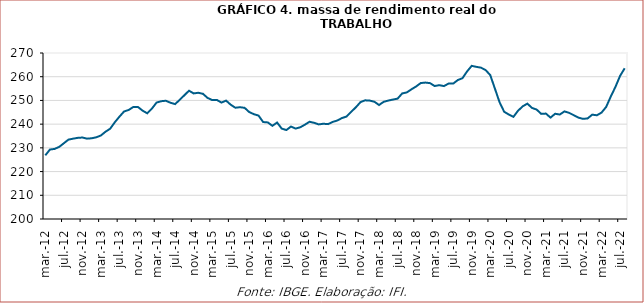
| Category | Massa de rendimento real do trabalho |
|---|---|
| 2012-03-01 | 226.842 |
| 2012-04-01 | 229.283 |
| 2012-05-01 | 229.555 |
| 2012-06-01 | 230.42 |
| 2012-07-01 | 231.95 |
| 2012-08-01 | 233.484 |
| 2012-09-01 | 233.881 |
| 2012-10-01 | 234.221 |
| 2012-11-01 | 234.352 |
| 2012-12-01 | 233.886 |
| 2013-01-01 | 234.04 |
| 2013-02-01 | 234.458 |
| 2013-03-01 | 235.239 |
| 2013-04-01 | 236.821 |
| 2013-05-01 | 238.086 |
| 2013-06-01 | 240.813 |
| 2013-07-01 | 243.174 |
| 2013-08-01 | 245.356 |
| 2013-09-01 | 245.987 |
| 2013-10-01 | 247.263 |
| 2013-11-01 | 247.222 |
| 2013-12-01 | 245.667 |
| 2014-01-01 | 244.569 |
| 2014-02-01 | 246.558 |
| 2014-03-01 | 249.095 |
| 2014-04-01 | 249.669 |
| 2014-05-01 | 249.868 |
| 2014-06-01 | 249.028 |
| 2014-07-01 | 248.457 |
| 2014-08-01 | 250.255 |
| 2014-09-01 | 252.189 |
| 2014-10-01 | 254.101 |
| 2014-11-01 | 252.96 |
| 2014-12-01 | 253.228 |
| 2015-01-01 | 252.799 |
| 2015-02-01 | 251.073 |
| 2015-03-01 | 250.164 |
| 2015-04-01 | 250.22 |
| 2015-05-01 | 249.094 |
| 2015-06-01 | 249.925 |
| 2015-07-01 | 248.195 |
| 2015-08-01 | 246.923 |
| 2015-09-01 | 247.143 |
| 2015-10-01 | 246.873 |
| 2015-11-01 | 245.089 |
| 2015-12-01 | 244.198 |
| 2016-01-01 | 243.604 |
| 2016-02-01 | 240.891 |
| 2016-03-01 | 240.726 |
| 2016-04-01 | 239.291 |
| 2016-05-01 | 240.682 |
| 2016-06-01 | 238.14 |
| 2016-07-01 | 237.509 |
| 2016-08-01 | 238.984 |
| 2016-09-01 | 238.131 |
| 2016-10-01 | 238.678 |
| 2016-11-01 | 239.767 |
| 2016-12-01 | 241.005 |
| 2017-01-01 | 240.557 |
| 2017-02-01 | 239.886 |
| 2017-03-01 | 240.172 |
| 2017-04-01 | 240.004 |
| 2017-05-01 | 240.935 |
| 2017-06-01 | 241.534 |
| 2017-07-01 | 242.566 |
| 2017-08-01 | 243.221 |
| 2017-09-01 | 245.207 |
| 2017-10-01 | 247.101 |
| 2017-11-01 | 249.286 |
| 2017-12-01 | 250.048 |
| 2018-01-01 | 249.926 |
| 2018-02-01 | 249.449 |
| 2018-03-01 | 248.066 |
| 2018-04-01 | 249.41 |
| 2018-05-01 | 249.943 |
| 2018-06-01 | 250.372 |
| 2018-07-01 | 250.748 |
| 2018-08-01 | 252.948 |
| 2018-09-01 | 253.385 |
| 2018-10-01 | 254.703 |
| 2018-11-01 | 255.886 |
| 2018-12-01 | 257.326 |
| 2019-01-01 | 257.527 |
| 2019-02-01 | 257.297 |
| 2019-03-01 | 256.071 |
| 2019-04-01 | 256.445 |
| 2019-05-01 | 256.037 |
| 2019-06-01 | 257.104 |
| 2019-07-01 | 257.097 |
| 2019-08-01 | 258.604 |
| 2019-09-01 | 259.38 |
| 2019-10-01 | 262.245 |
| 2019-11-01 | 264.583 |
| 2019-12-01 | 264.158 |
| 2020-01-01 | 263.813 |
| 2020-02-01 | 262.811 |
| 2020-03-01 | 260.659 |
| 2020-04-01 | 254.983 |
| 2020-05-01 | 249.264 |
| 2020-06-01 | 245.215 |
| 2020-07-01 | 244.054 |
| 2020-08-01 | 243.091 |
| 2020-09-01 | 245.671 |
| 2020-10-01 | 247.509 |
| 2020-11-01 | 248.651 |
| 2020-12-01 | 246.843 |
| 2021-01-01 | 246.152 |
| 2021-02-01 | 244.33 |
| 2021-03-01 | 244.461 |
| 2021-04-01 | 242.753 |
| 2021-05-01 | 244.384 |
| 2021-06-01 | 244.042 |
| 2021-07-01 | 245.381 |
| 2021-08-01 | 244.765 |
| 2021-09-01 | 243.787 |
| 2021-10-01 | 242.767 |
| 2021-11-01 | 242.227 |
| 2021-12-01 | 242.41 |
| 2022-01-01 | 244.004 |
| 2022-02-01 | 243.737 |
| 2022-03-01 | 244.855 |
| 2022-04-01 | 247.245 |
| 2022-05-01 | 251.637 |
| 2022-06-01 | 255.688 |
| 2022-07-01 | 260.332 |
| 2022-08-01 | 263.549 |